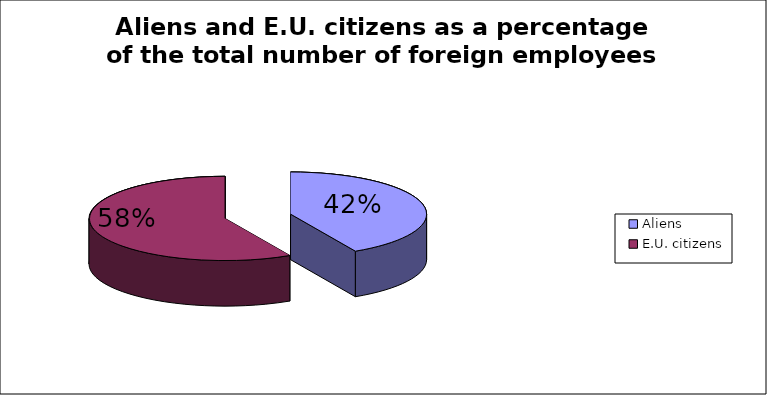
| Category | Series 0 |
|---|---|
| Aliens | 63076.333 |
| E.U. citizens | 86772.667 |